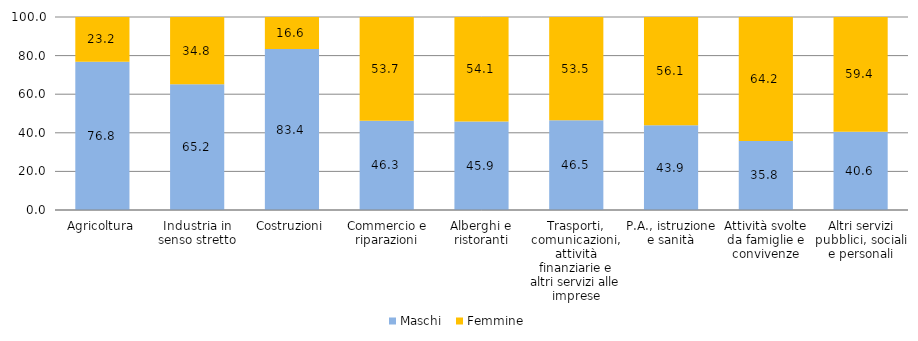
| Category | Maschi  | Femmine |
|---|---|---|
| Agricoltura | 76.8 | 23.2 |
| Industria in senso stretto | 65.2 | 34.8 |
| Costruzioni | 83.4 | 16.6 |
| Commercio e riparazioni | 46.3 | 53.7 |
| Alberghi e ristoranti | 45.9 | 54.1 |
| Trasporti, comunicazioni, attività finanziarie e altri servizi alle imprese | 46.5 | 53.5 |
| P.A., istruzione e sanità | 43.9 | 56.1 |
| Attività svolte da famiglie e convivenze | 35.8 | 64.2 |
| Altri servizi pubblici, sociali e personali | 40.6 | 59.4 |